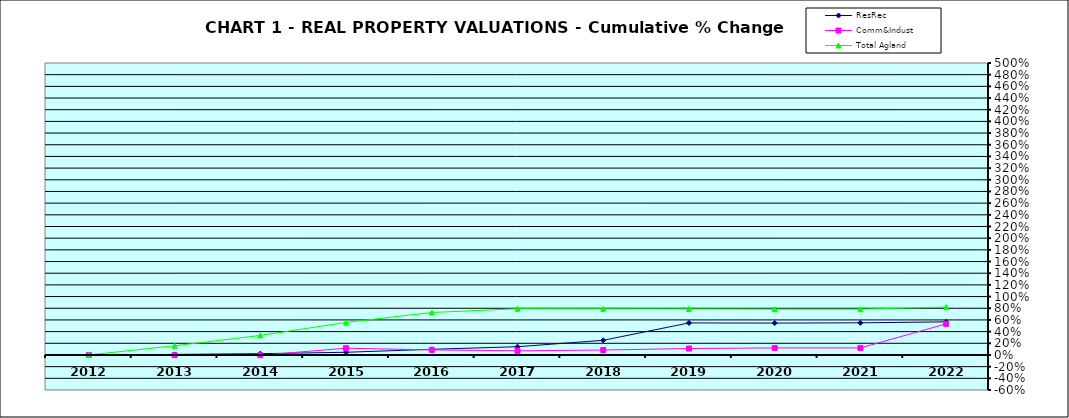
| Category | ResRec | Comm&Indust | Total Agland |
|---|---|---|---|
| 2012.0 | 0 | 0 | 0 |
| 2013.0 | 0.009 | -0.003 | 0.157 |
| 2014.0 | 0.022 | -0.004 | 0.335 |
| 2015.0 | 0.046 | 0.115 | 0.557 |
| 2016.0 | 0.097 | 0.087 | 0.727 |
| 2017.0 | 0.141 | 0.071 | 0.791 |
| 2018.0 | 0.251 | 0.084 | 0.79 |
| 2019.0 | 0.549 | 0.11 | 0.788 |
| 2020.0 | 0.546 | 0.121 | 0.784 |
| 2021.0 | 0.551 | 0.121 | 0.784 |
| 2022.0 | 0.567 | 0.532 | 0.82 |